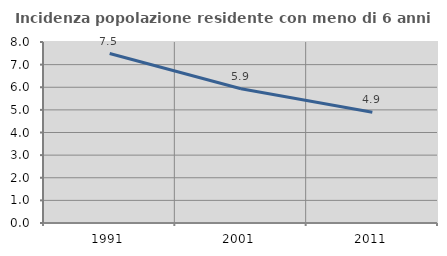
| Category | Incidenza popolazione residente con meno di 6 anni |
|---|---|
| 1991.0 | 7.492 |
| 2001.0 | 5.931 |
| 2011.0 | 4.894 |